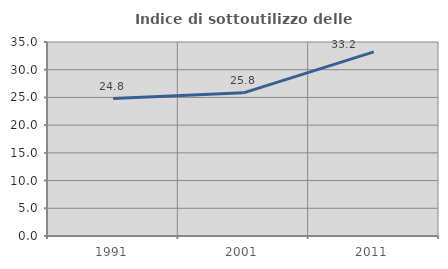
| Category | Indice di sottoutilizzo delle abitazioni  |
|---|---|
| 1991.0 | 24.798 |
| 2001.0 | 25.832 |
| 2011.0 | 33.215 |